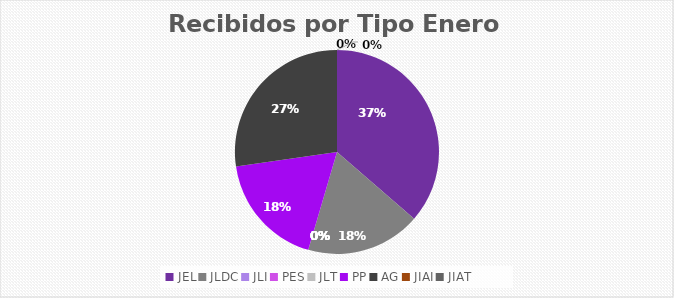
| Category | Series 0 |
|---|---|
| JEL | 4 |
| JLDC | 2 |
| JLI | 0 |
| PES | 0 |
| JLT | 0 |
| PP | 2 |
| AG | 3 |
| JIAI | 0 |
| JIAT | 0 |